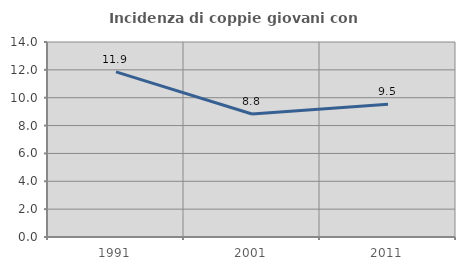
| Category | Incidenza di coppie giovani con figli |
|---|---|
| 1991.0 | 11.859 |
| 2001.0 | 8.83 |
| 2011.0 | 9.527 |